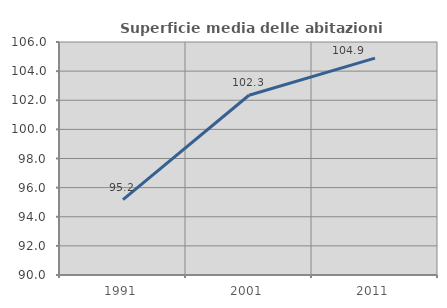
| Category | Superficie media delle abitazioni occupate |
|---|---|
| 1991.0 | 95.171 |
| 2001.0 | 102.342 |
| 2011.0 | 104.895 |